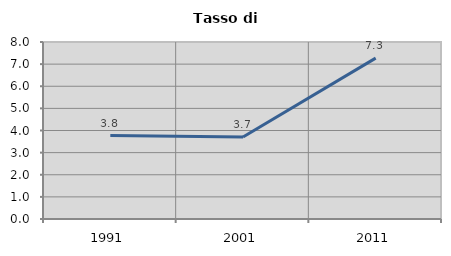
| Category | Tasso di disoccupazione   |
|---|---|
| 1991.0 | 3.774 |
| 2001.0 | 3.704 |
| 2011.0 | 7.273 |